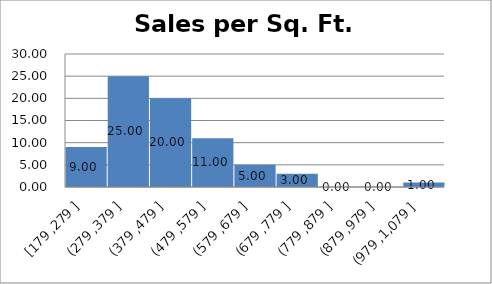
| Category | MedAge |
|---|---|
| 34.4 | 701.97 |
| 41.2 | 209.93 |
| 40.3 | 364.92 |
| 35.4 | 443.04 |
| 31.5 | 399.2 |
| 36.3 | 264.64 |
| 35.1 | 571.59 |
| 37.6 | 642.25 |
| 34.9 | 461.45 |
| 34.8 | 638.82 |
| 36.2 | 484.38 |
| 32.2 | 581.09 |
| 30.9 | 267.71 |
| 37.7 | 572.84 |
| 34.3 | 586.48 |
| 32.4 | 368.73 |
| 32.1 | 351.47 |
| 31.4 | 458.24 |
| 30.4 | 987.12 |
| 33.9 | 357.45 |
| 35.6 | 405.77 |
| 35.9 | 680.8 |
| 33.6 | 368.02 |
| 37.9 | 303.95 |
| 40.6 | 393.9 |
| 37.7 | 562.12 |
| 36.4 | 494.88 |
| 40.9 | 310.07 |
| 35.0 | 373.46 |
| 26.4 | 235.81 |
| 37.1 | 413.08 |
| 30.3 | 625.22 |
| 31.3 | 274.3 |
| 29.6 | 542.62 |
| 32.9 | 178.56 |
| 40.7 | 375.33 |
| 29.3 | 329.09 |
| 37.3 | 297.37 |
| 39.8 | 323.17 |
| 33.9 | 468.84 |
| 35.0 | 352.57 |
| 35.0 | 380.34 |
| 35.9 | 398.12 |
| 33.0 | 312.15 |
| 30.9 | 452.16 |
| 38.5 | 698.64 |
| 40.5 | 367.19 |
| 32.1 | 431.93 |
| 34.8 | 367.06 |
| 38.0 | 400.53 |
| 37.0 | 414.36 |
| 34.7 | 481.11 |
| 36.4 | 538.06 |
| 36.8 | 330.48 |
| 32.2 | 249.93 |
| 34.8 | 291.87 |
| 36.7 | 517.4 |
| 33.8 | 551.58 |
| 34.2 | 386.81 |
| 39.0 | 427.5 |
| 34.9 | 453.94 |
| 39.3 | 512.46 |
| 35.6 | 345.27 |
| 36.0 | 234.04 |
| 41.1 | 348.33 |
| 24.7 | 348.47 |
| 40.5 | 294.95 |
| 32.9 | 361.14 |
| 30.3 | 467.71 |
| 36.2 | 403.78 |
| 32.4 | 245.74 |
| 43.5 | 339.94 |
| 41.6 | 400.82 |
| 31.4 | 326.54 |